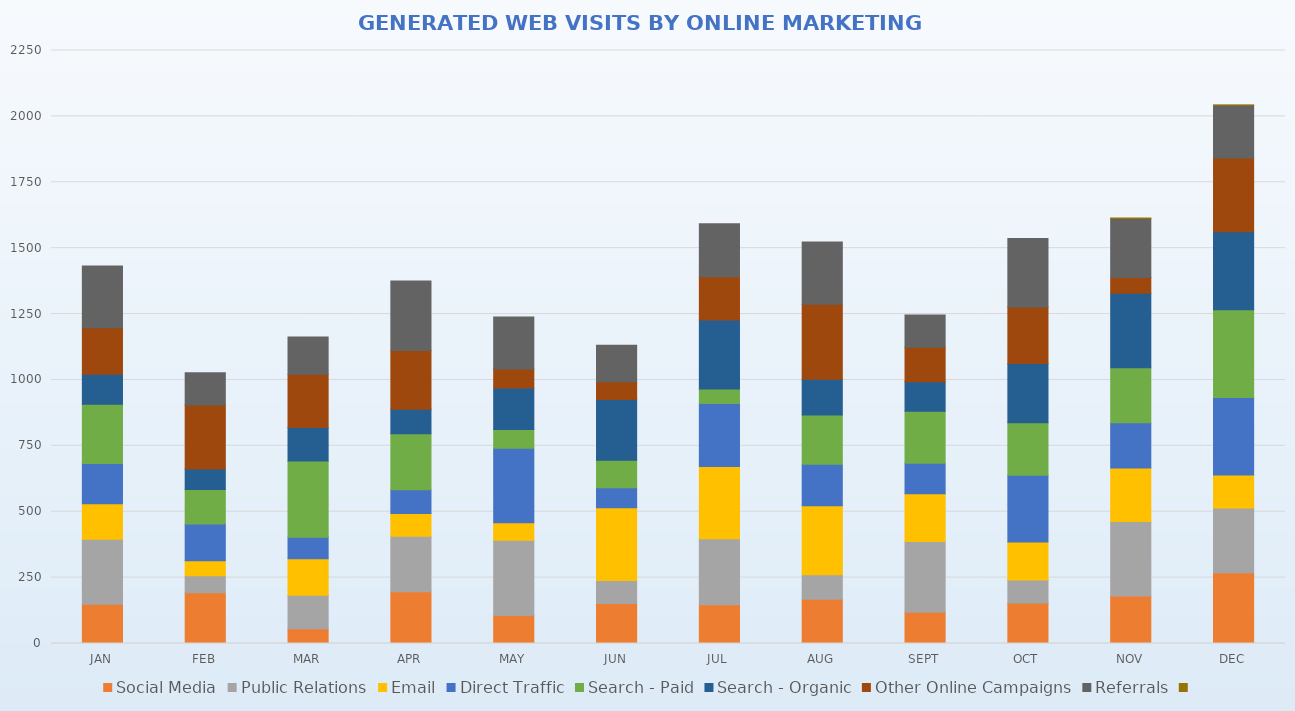
| Category | Social Media | Public Relations | Email | Direct Traffic | Search - Paid | Search - Organic | Other Online Campaigns | Referrals | Series 9 |
|---|---|---|---|---|---|---|---|---|---|
| JAN | 149 | 247 | 134 | 153 | 225 | 114 | 176 | 234 | 0 |
| FEB | 193 | 64 | 57 | 139 | 131 | 78 | 243 | 122 | 0 |
| MAR | 56 | 127 | 139 | 81 | 289 | 128 | 202 | 141 | 0 |
| APR | 196 | 211 | 86 | 90 | 213 | 93 | 223 | 263 | 0 |
| MAY | 106 | 286 | 66 | 283 | 71 | 157 | 73 | 197 | 0 |
| JUN | 152 | 87 | 276 | 76 | 104 | 231 | 67 | 139 | 0 |
| JUL | 147 | 250 | 275 | 239 | 55 | 261 | 165 | 201 | 0 |
| AUG | 168 | 93 | 262 | 157 | 187 | 136 | 284 | 236 | 0 |
| SEPT | 119 | 268 | 181 | 116 | 197 | 112 | 131 | 122 | 0 |
| OCT | 154 | 87 | 144 | 253 | 200 | 224 | 215 | 260 | 0 |
| NOV | 180 | 283 | 203 | 172 | 208 | 283 | 60 | 224 | 1 |
| DEC | 268 | 246 | 125 | 294 | 333 | 296 | 280 | 200 | 1 |